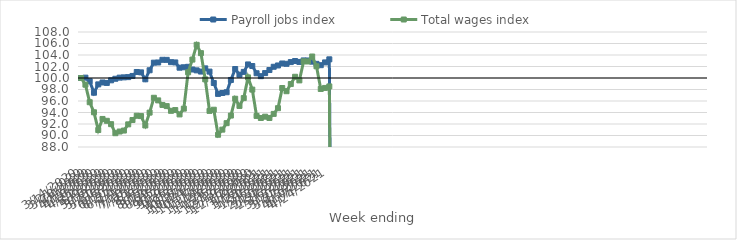
| Category | Payroll jobs index | Total wages index |
|---|---|---|
| 14/03/2020 | 100 | 100 |
| 21/03/2020 | 100.062 | 98.837 |
| 28/03/2020 | 99.437 | 95.789 |
| 04/04/2020 | 97.439 | 94.038 |
| 11/04/2020 | 98.891 | 90.954 |
| 18/04/2020 | 99.221 | 92.879 |
| 25/04/2020 | 99.139 | 92.554 |
| 02/05/2020 | 99.598 | 91.971 |
| 09/05/2020 | 99.867 | 90.398 |
| 16/05/2020 | 100.064 | 90.69 |
| 23/05/2020 | 100.111 | 90.86 |
| 30/05/2020 | 100.154 | 91.938 |
| 06/06/2020 | 100.359 | 92.692 |
| 13/06/2020 | 101.045 | 93.434 |
| 20/06/2020 | 100.979 | 93.376 |
| 27/06/2020 | 99.773 | 91.744 |
| 04/07/2020 | 101.342 | 93.979 |
| 11/07/2020 | 102.667 | 96.561 |
| 18/07/2020 | 102.7 | 96.108 |
| 25/07/2020 | 103.164 | 95.314 |
| 01/08/2020 | 103.154 | 95.113 |
| 08/08/2020 | 102.753 | 94.293 |
| 15/08/2020 | 102.707 | 94.426 |
| 22/08/2020 | 101.793 | 93.668 |
| 29/08/2020 | 101.865 | 94.671 |
| 05/09/2020 | 101.947 | 100.993 |
| 12/09/2020 | 101.478 | 103.202 |
| 19/09/2020 | 101.326 | 105.77 |
| 26/09/2020 | 101.12 | 104.321 |
| 03/10/2020 | 101.674 | 99.762 |
| 10/10/2020 | 101.113 | 94.282 |
| 17/10/2020 | 99.131 | 94.481 |
| 24/10/2020 | 97.236 | 90.129 |
| 31/10/2020 | 97.391 | 91.019 |
| 07/11/2020 | 97.524 | 92.146 |
| 14/11/2020 | 99.655 | 93.465 |
| 21/11/2020 | 101.563 | 96.393 |
| 28/11/2020 | 100.575 | 95.145 |
| 05/12/2020 | 101.061 | 96.505 |
| 12/12/2020 | 102.36 | 100.108 |
| 19/12/2020 | 102.084 | 97.981 |
| 26/12/2020 | 100.826 | 93.405 |
| 02/01/2021 | 100.316 | 93.046 |
| 09/01/2021 | 100.857 | 93.272 |
| 16/01/2021 | 101.388 | 93.047 |
| 23/01/2021 | 101.952 | 93.758 |
| 30/01/2021 | 102.182 | 94.748 |
| 06/02/2021 | 102.526 | 98.26 |
| 13/02/2021 | 102.469 | 97.702 |
| 20/02/2021 | 102.768 | 98.948 |
| 27/02/2021 | 102.951 | 100.214 |
| 06/03/2021 | 102.792 | 99.584 |
| 13/03/2021 | 103.055 | 102.9 |
| 20/03/2021 | 103.046 | 102.873 |
| 27/03/2021 | 102.84 | 103.734 |
| 03/04/2021 | 102.46 | 102.037 |
| 10/04/2021 | 102.229 | 98.095 |
| 17/04/2021 | 102.709 | 98.274 |
| 24/04/2021 | 103.245 | 98.536 |